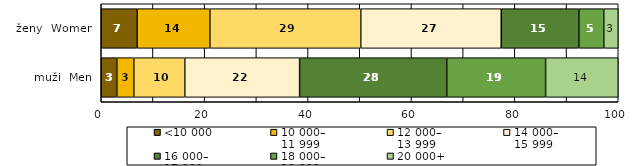
| Category | <10 000 | 10 000–
11 999 | 12 000–
13 999 | 14 000–
15 999 | 16 000–
17 999 | 18 000–
19 999 | 20 000+ |
|---|---|---|---|---|---|---|---|
| muži  Men | 3.018 | 3.279 | 9.86 | 22.208 | 28.457 | 19.127 | 14.051 |
| ženy  Women | 6.948 | 14.065 | 29.181 | 27.176 | 15.008 | 4.826 | 2.796 |